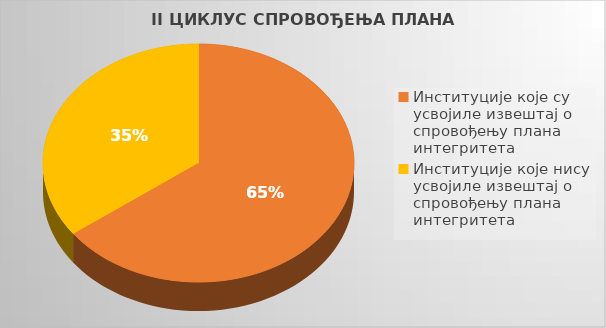
| Category | Series 0 |
|---|---|
| Институције које су усвојиле извештај о спровођењу плана интегритета | 0.649 |
| Институције које нису усвојиле извештај о спровођењу плана интегритета | 0.351 |